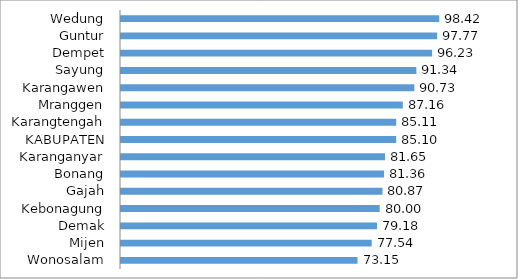
| Category | Series 0 |
|---|---|
| Wonosalam | 73.15 |
| Mijen | 77.54 |
| Demak | 79.18 |
| Kebonagung | 80 |
| Gajah | 80.87 |
| Bonang | 81.36 |
| Karanganyar | 81.65 |
| KABUPATEN | 85.1 |
| Karangtengah | 85.11 |
| Mranggen | 87.16 |
| Karangawen | 90.73 |
| Sayung | 91.34 |
| Dempet | 96.23 |
| Guntur | 97.77 |
| Wedung | 98.42 |